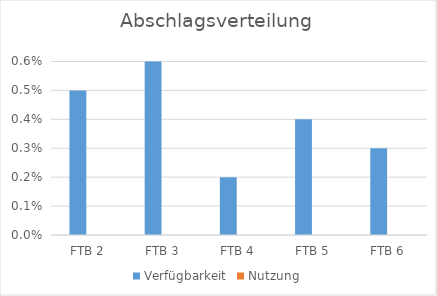
| Category | Verfügbarkeit | Nutzung |
|---|---|---|
| FTB 2 | 0.005 | 0 |
| FTB 3 | 0.006 | 0 |
| FTB 4 | 0.002 | 0 |
| FTB 5 | 0.004 | 0 |
| FTB 6 | 0.003 | 0 |